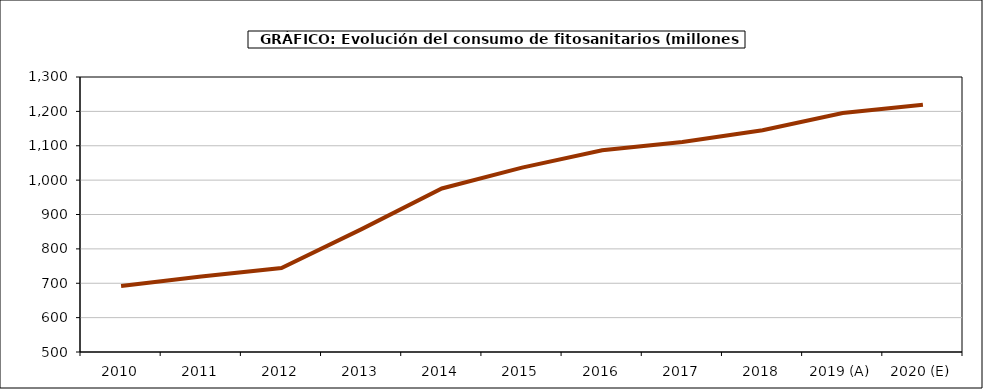
| Category | fitosanitarios |
|---|---|
| 2010 | 692.238 |
| 2011 | 719.583 |
| 2012 | 744.231 |
| 2013 | 857.443 |
| 2014 | 975.802 |
| 2015 | 1036.274 |
| 2016 | 1086.927 |
| 2017 | 1110.713 |
| 2018 | 1145.257 |
| 2019 (A) | 1195.414 |
| 2020 (E) | 1219.574 |